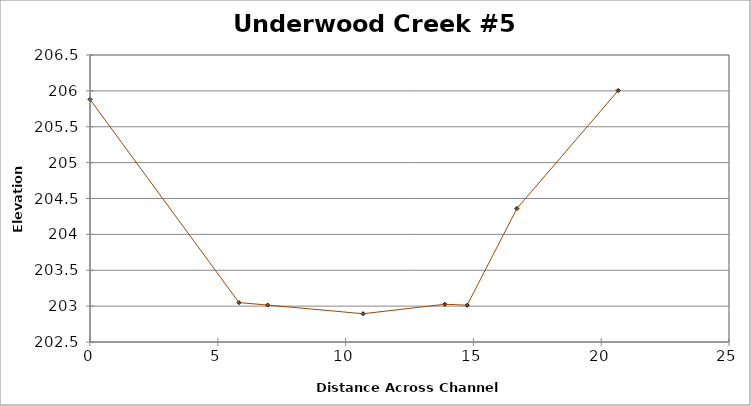
| Category | Series 0 |
|---|---|
| 0.0 | 205.881 |
| 5.830386951122785 | 203.049 |
| 6.951899021175375 | 203.015 |
| 10.684152049259609 | 202.894 |
| 13.88147272470428 | 203.026 |
| 14.755865884813735 | 203.013 |
| 16.702214015472848 | 204.36 |
| 20.66507268352331 | 206.005 |